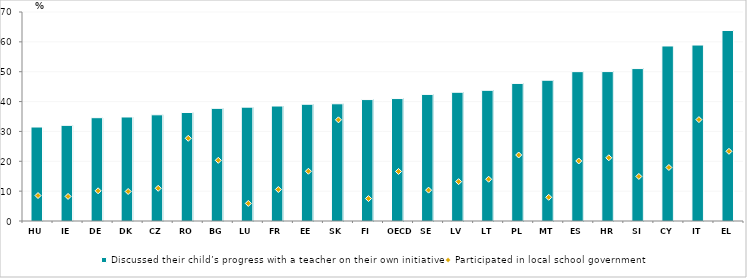
| Category | Discussed their child’s progress with a teacher on their own initiative |
|---|---|
| HU | 31.476 |
| IE | 32.031 |
| DE | 34.598 |
| DK | 34.837 |
| CZ | 35.569 |
| RO | 36.342 |
| BG | 37.725 |
| LU | 38.132 |
| FR | 38.509 |
| EE | 39.102 |
| SK | 39.256 |
| FI | 40.672 |
| OECD | 41.013 |
| SE | 42.402 |
| LV | 43.119 |
| LT | 43.77 |
| PL | 46.079 |
| MT | 47.147 |
| ES | 50.023 |
| HR | 50.042 |
| SI | 51.054 |
| CY | 58.62 |
| IT | 58.932 |
| EL | 63.805 |